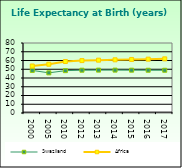
| Category | Swaziland | Africa                        |
|---|---|---|
| 2000.0 | 48.689 | 53.721 |
| 2005.0 | 45.891 | 55.757 |
| 2010.0 | 48.398 | 58.857 |
| 2012.0 | 48.91 | 59.91 |
| 2013.0 | 49.001 | 60.376 |
| 2014.0 | 49.001 | 60.801 |
| 2015.0 | 48.943 | 61.187 |
| 2016.0 | 48.873 | 61.538 |
| 2017.0 | 48.844 | 61.865 |